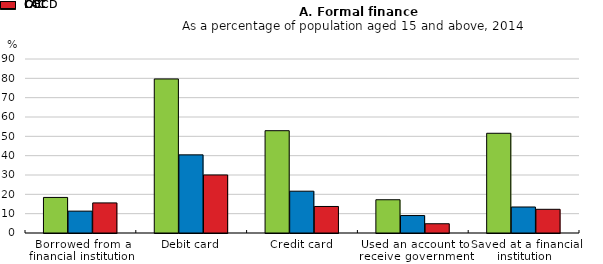
| Category | OECD | LAC | COL |
|---|---|---|---|
| Borrowed from a financial institution | 18.4 | 11.307 | 15.565 |
| Debit card | 79.677 | 40.414 | 30.032 |
| Credit card | 52.919 | 21.62 | 13.716 |
| Used an account to receive government transfers | 17.2 | 9.02 | 4.786 |
| Saved at a financial institution | 51.585 | 13.456 | 12.253 |